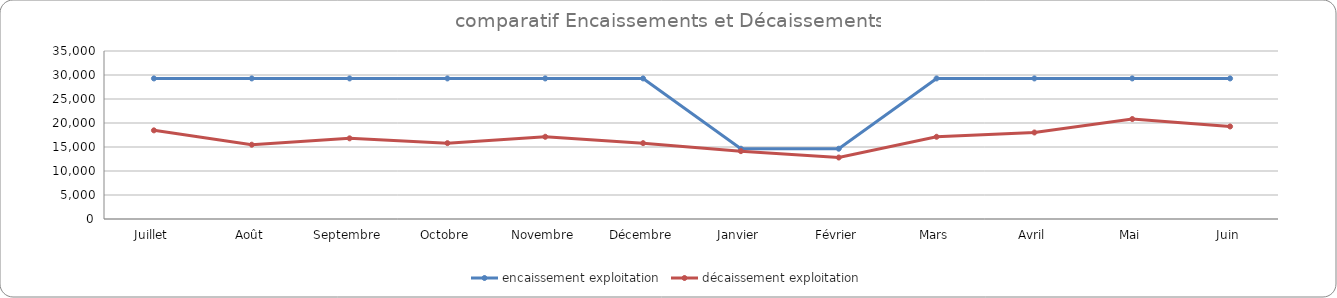
| Category | encaissement exploitation | décaissement exploitation |
|---|---|---|
| Juillet | 29283.93 | 18468.297 |
| Août | 29283.93 | 15476.3 |
| Septembre | 29283.93 | 16803.7 |
| Octobre | 29283.93 | 15803.634 |
| Novembre | 29283.93 | 17131.034 |
| Décembre | 29283.93 | 15803.634 |
| Janvier | 14641.965 | 14136.038 |
| Février | 14641.965 | 12808.638 |
| Mars | 29283.93 | 17131.034 |
| Avril | 29283.93 | 18022.871 |
| Mai | 29283.93 | 20825.594 |
| Juin | 29283.93 | 19276.961 |